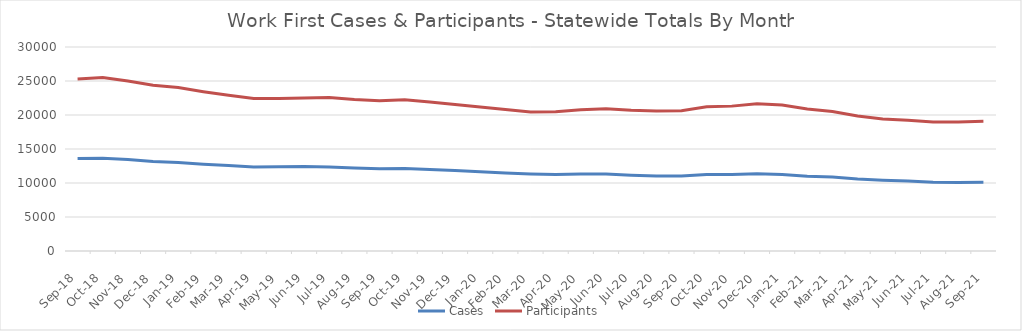
| Category | Cases | Participants |
|---|---|---|
| 2021-09-21 | 10102 | 19085 |
| 2021-08-21 | 10090 | 18974 |
| 2021-07-21 | 10121 | 18988 |
| 2021-06-21 | 10298 | 19211 |
| 2021-05-21 | 10411 | 19413 |
| 2021-04-21 | 10601 | 19845 |
| 2021-03-21 | 10888 | 20521 |
| 2021-02-21 | 11007 | 20877 |
| 2021-01-21 | 11252 | 21466 |
| 2020-12-20 | 11350 | 21641 |
| 2020-11-20 | 11255 | 21305 |
| 2020-10-20 | 11243 | 21198 |
| 2020-09-20 | 11030 | 20626 |
| 2020-08-20 | 11034 | 20575 |
| 2020-07-20 | 11137 | 20693 |
| 2020-06-20 | 11320 | 20921 |
| 2020-05-20 | 11330 | 20766 |
| 2020-04-20 | 11263 | 20490 |
| 2020-03-20 | 11330 | 20431 |
| 2020-02-20 | 11473 | 20821 |
| 2020-01-20 | 11654 | 21174 |
| 2019-12-19 | 11822 | 21539 |
| 2019-11-19 | 11990 | 21921 |
| 2019-10-19 | 12136 | 22233 |
| 2019-09-19 | 12092 | 22105 |
| 2019-08-19 | 12206 | 22284 |
| 2019-07-19 | 12346 | 22563 |
| 2019-06-19 | 12412 | 22512 |
| 2019-05-19 | 12393 | 22436 |
| 2019-04-19 | 12365 | 22412 |
| 2019-03-01 | 12560 | 22890 |
| 2019-02-01 | 12766 | 23428 |
| 2019-01-01 | 13027 | 24029 |
| 2018-12-01 | 13157 | 24372 |
| 2018-11-01 | 13439 | 25009 |
| 2018-10-01 | 13656 | 25510 |
| 2018-09-01 | 13611 | 25301 |